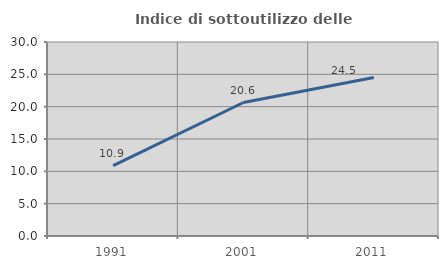
| Category | Indice di sottoutilizzo delle abitazioni  |
|---|---|
| 1991.0 | 10.87 |
| 2001.0 | 20.642 |
| 2011.0 | 24.51 |